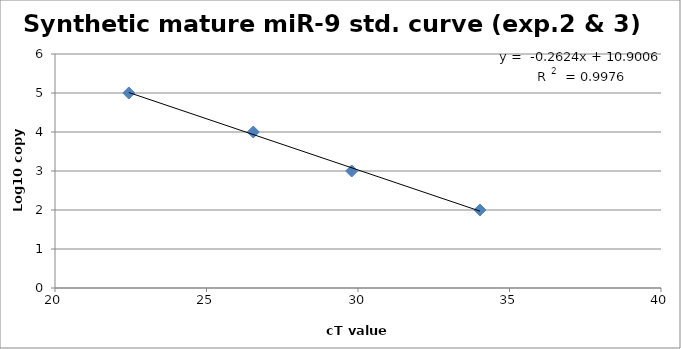
| Category | Log10 copy no. |
|---|---|
| 34.02364540100098 | 2 |
| 29.792454719543457 | 3 |
| 26.543169021606445 | 4 |
| 22.435943603515625 | 5 |